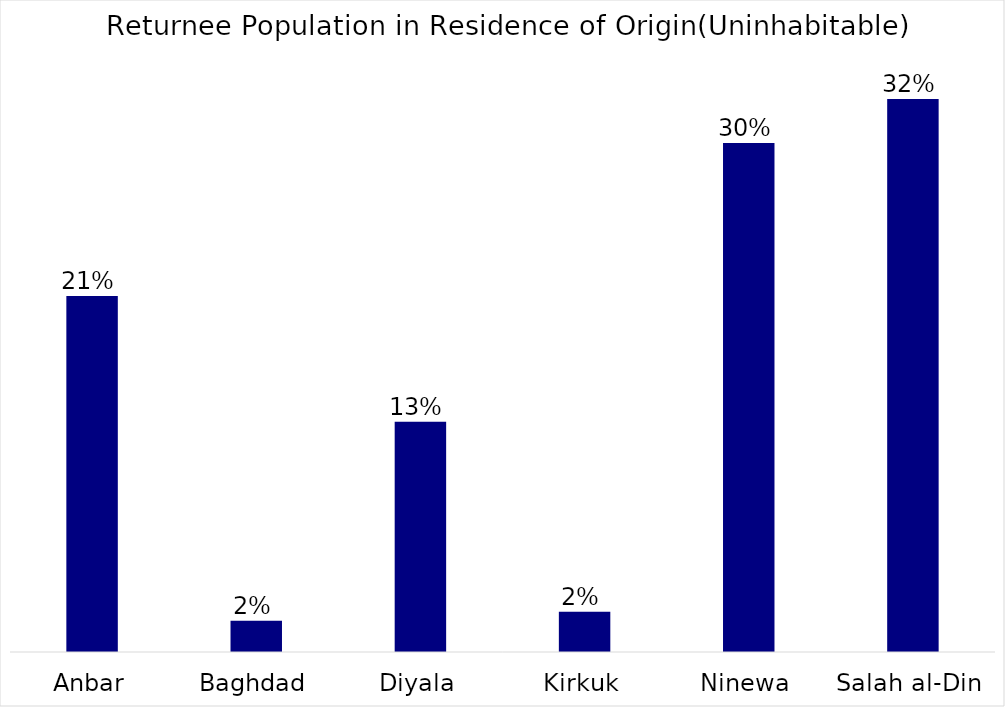
| Category | Series 0 |
|---|---|
| Anbar | 0.207 |
| Baghdad | 0.018 |
| Diyala | 0.134 |
| Kirkuk | 0.023 |
| Ninewa | 0.296 |
| Salah al-Din | 0.322 |